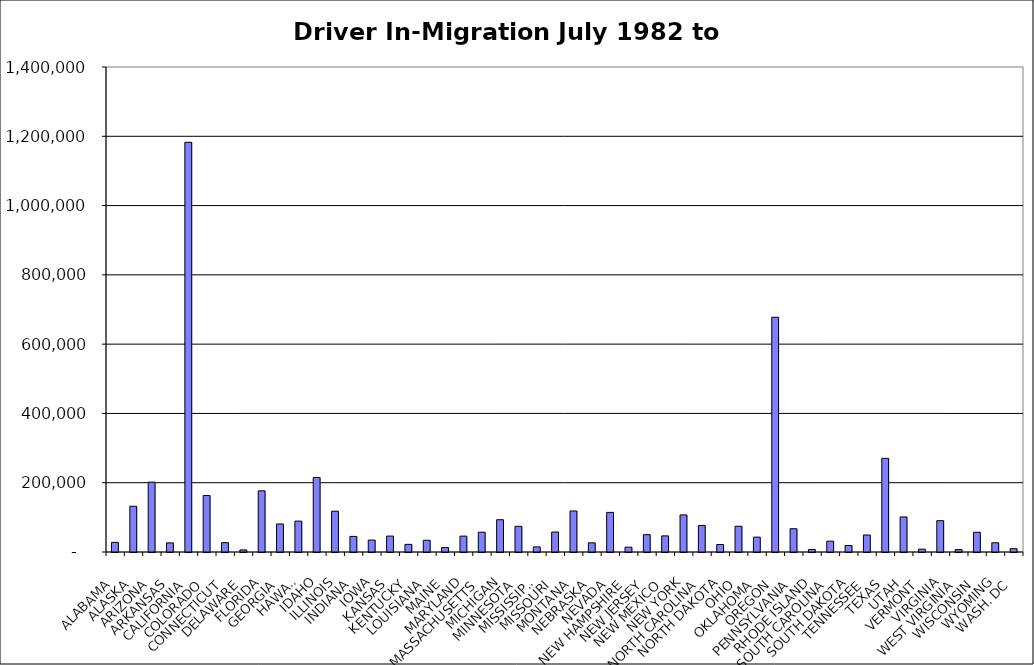
| Category | Series 0 |
|---|---|
| ALABAMA | 27825.5 |
| ALASKA | 132026.5 |
| ARIZONA | 201591 |
| ARKANSAS | 26376.5 |
| CALIFORNIA | 1182609.5 |
| COLORADO | 162998 |
| CONNECTICUT | 27001 |
| DELAWARE | 5958.5 |
| FLORIDA | 176546 |
| GEORGIA | 80860 |
| HAWAII | 89134.5 |
| IDAHO | 214952.5 |
| ILLINOIS | 117730.5 |
| INDIANA | 44982 |
| IOWA | 34433.5 |
| KANSAS | 45972.5 |
| KENTUCKY | 22038 |
| LOUISIANA | 33894.5 |
| MAINE | 12791.5 |
| MARYLAND | 45867 |
| MASSACHUSETTS | 57015 |
| MICHIGAN | 93179 |
| MINNESOTA | 74129.5 |
| MISSISSIPPI | 14765 |
| MISSOURI | 57583 |
| MONTANA | 118443 |
| NEBRASKA | 26433.5 |
| NEVADA | 114352 |
| NEW HAMPSHIRE | 13929.5 |
| NEW JERSEY | 50056 |
| NEW MEXICO | 46542 |
| NEW YORK | 107050 |
| NORTH CAROLINA | 76525.5 |
| NORTH DAKOTA | 21665.5 |
| OHIO | 74369.5 |
| OKLAHOMA | 42892 |
| OREGON | 677621 |
| PENNSYLVANIA | 67165.5 |
| RHODE ISLAND | 7313 |
| SOUTH CAROLINA | 31295.5 |
| SOUTH DAKOTA | 18716.5 |
| TENNESSEE | 48996.5 |
| TEXAS | 270422 |
| UTAH | 101171.5 |
| VERMONT | 8187 |
| VIRGINIA | 90412 |
| WEST VIRGINIA | 6913.5 |
| WISCONSIN | 56919.5 |
| WYOMING | 26633 |
| WASH. DC | 9531 |